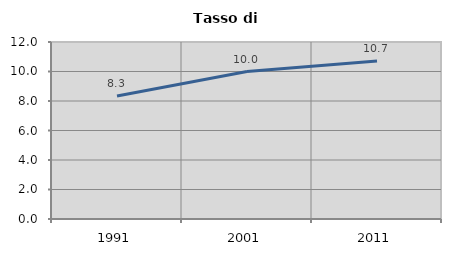
| Category | Tasso di disoccupazione   |
|---|---|
| 1991.0 | 8.333 |
| 2001.0 | 10 |
| 2011.0 | 10.714 |